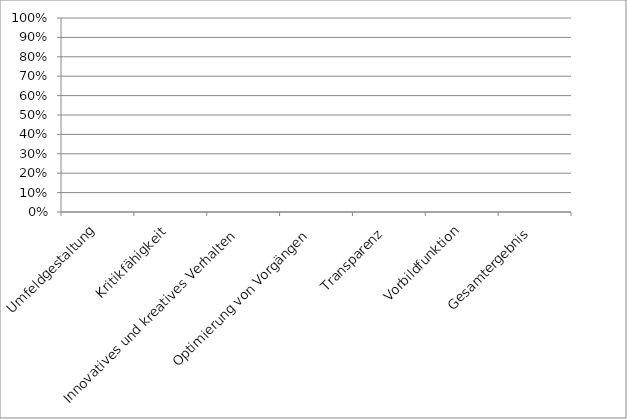
| Category | Series 0 |
|---|---|
| Umfeldgestaltung | 0 |
| Kritikfähigkeit | 0 |
| Innovatives und kreatives Verhalten | 0 |
| Optimierung von Vorgängen | 0 |
| Transparenz | 0 |
| Vorbildfunktion | 0 |
| Gesamtergebnis | 0 |